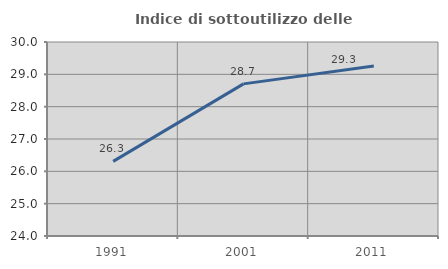
| Category | Indice di sottoutilizzo delle abitazioni  |
|---|---|
| 1991.0 | 26.309 |
| 2001.0 | 28.705 |
| 2011.0 | 29.258 |